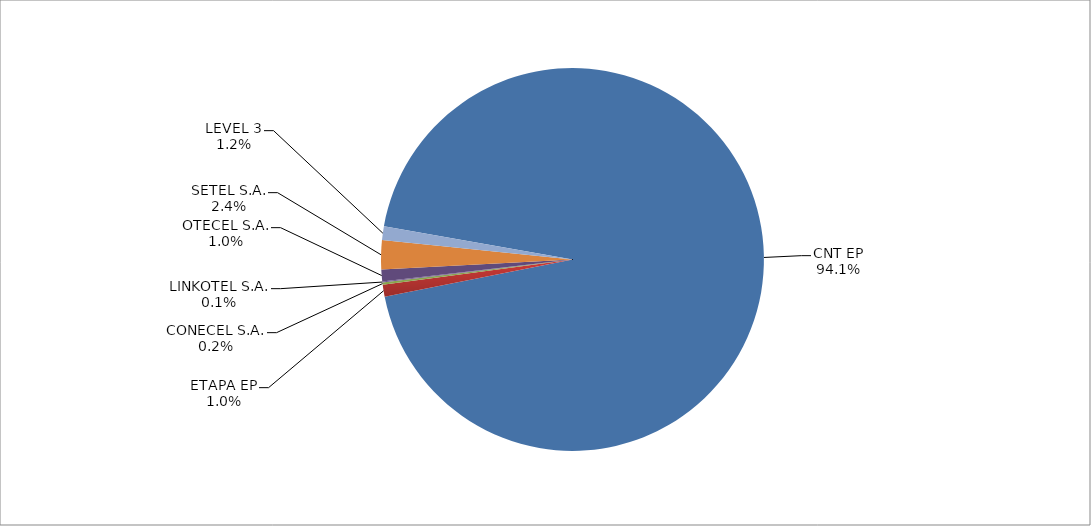
| Category | Series 0 |
|---|---|
| CNT EP | 2506 |
| ETAPA EP | 27 |
| CONECEL S.A. | 5 |
| LINKOTEL S.A. | 2 |
| OTECEL S.A. | 27 |
| SETEL S.A. | 65 |
| LEVEL 3 | 31 |